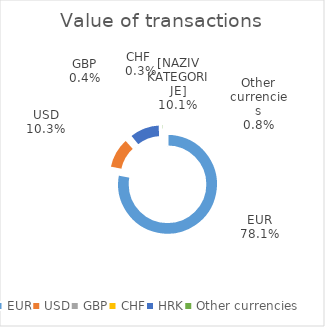
| Category | Value of transactions |
|---|---|
| EUR | 200724506781 |
| USD | 26548460468 |
| GBP | 1009221929 |
| CHF | 623187290 |
| HRK | 26036543402 |
| Other currencies | 1984358669 |